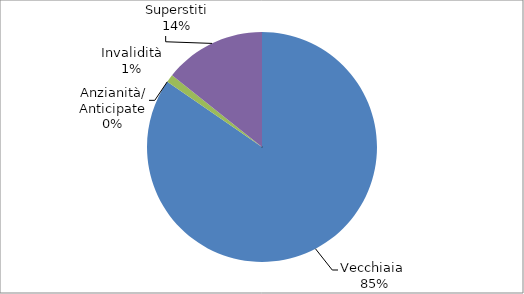
| Category | Series 0 |
|---|---|
| Vecchiaia  | 28961 |
| Anzianità/ Anticipate | 0 |
| Invalidità | 377 |
| Superstiti | 4895 |